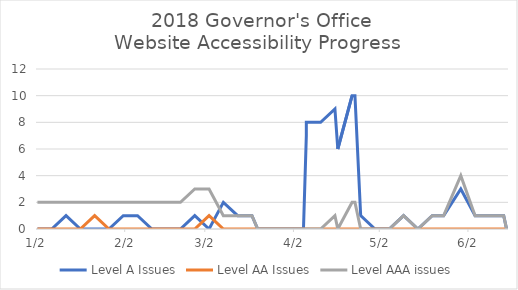
| Category | Level A Issues | Level AA Issues | Level AAA issues |
|---|---|---|---|
| 2018-01-02 22:25:20 | 0 | 0 | 2 |
| 2018-01-07 22:03:56 | 0 | 0 | 2 |
| 2018-01-12 21:57:15 | 1 | 0 | 2 |
| 2018-01-17 23:21:51 | 0 | 0 | 2 |
| 2018-01-22 21:57:46 | 0 | 1 | 2 |
| 2018-01-27 22:15:01 | 0 | 0 | 2 |
| 2018-02-01 22:00:35 | 1 | 0 | 2 |
| 2018-02-06 22:40:51 | 1 | 0 | 2 |
| 2018-02-11 22:20:39 | 0 | 0 | 2 |
| 2018-02-16 22:50:01 | 0 | 0 | 2 |
| 2018-02-21 23:03:38 | 0 | 0 | 2 |
| 2018-02-26 22:15:38 | 1 | 0 | 3 |
| 2018-03-03 22:06:04 | 0 | 1 | 3 |
| 2018-03-08 21:44:29 | 2 | 0 | 1 |
| 2018-03-13 22:46:26 | 1 | 0 | 1 |
| 2018-03-18 22:40:17 | 1 | 0 | 1 |
| 2018-03-20 13:32:33 | 0 | 0 | 0 |
| 2018-03-24 23:40:22 | 0 | 0 | 0 |
| 2018-03-29 22:13:19 | 0 | 0 | 0 |
| 2018-04-03 21:46:44 | 0 | 0 | 0 |
| 2018-04-05 11:30:35 | 0 | 0 | 0 |
| 2018-04-06 09:36:35 | 7 | 0 | 0 |
| 2018-04-06 15:12:26 | 8 | 0 | 0 |
| 2018-04-11 00:09:31 | 8 | 0 | 0 |
| 2018-04-16 00:57:18 | 9 | 0 | 1 |
| 2018-04-17 12:21:40 | 6 | 0 | 0 |
| 2018-04-17 15:32:23 | 6 | 0 | 0 |
| 2018-04-22 00:57:06 | 10 | 0 | 2 |
| 2018-04-23 07:28:14 | 10 | 0 | 2 |
| 2018-04-25 10:39:19 | 1 | 0 | 0 |
| 2018-04-30 00:49:09 | 0 | 0 | 0 |
| 2018-05-05 00:20:32 | 0 | 0 | 0 |
| 2018-05-10 00:47:22 | 1 | 0 | 1 |
| 2018-05-15 00:42:45 | 0 | 0 | 0 |
| 2018-05-20 00:24:19 | 1 | 0 | 1 |
| 2018-05-24 23:27:11 | 1 | 0 | 1 |
| 2018-05-30 01:02:51 | 3 | 0 | 4 |
| 2018-06-04 01:14:19 | 1 | 0 | 1 |
| 2018-06-09 03:15:34 | 1 | 0 | 1 |
| 2018-06-14 02:30:21 | 1 | 0 | 1 |
| 2018-06-15 22:25:37 | 0 | 0 | 0 |